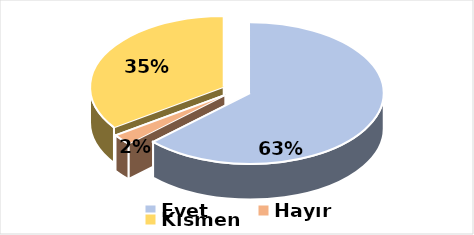
| Category | Evet |
|---|---|
| Evet | 0.629 |
| Hayır | 0.024 |
| Kısmen | 0.347 |